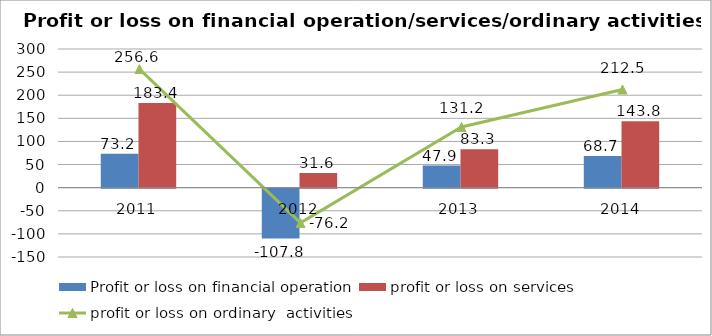
| Category | Profit or loss on financial operation | profit or loss on services |
|---|---|---|
| 2011.0 | 73.2 | 183.4 |
| 2012.0 | -107.8 | 31.6 |
| 2013.0 | 47.9 | 83.3 |
| 2014.0 | 68.7 | 143.8 |